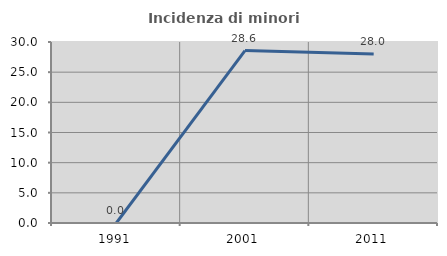
| Category | Incidenza di minori stranieri |
|---|---|
| 1991.0 | 0 |
| 2001.0 | 28.571 |
| 2011.0 | 28 |